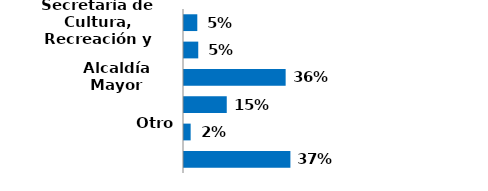
| Category | Series 0 |
|---|---|
| Secretaría de Cultura, Recreación y Deporte | 0.047 |
| IDRD | 0.05 |
| Alcaldía Mayor | 0.357 |
| Cinemateca Distrital | 0.15 |
| Otro | 0.023 |
| No aplica | 0.373 |